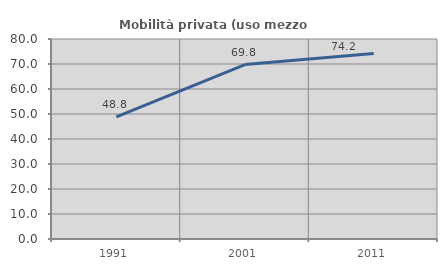
| Category | Mobilità privata (uso mezzo privato) |
|---|---|
| 1991.0 | 48.837 |
| 2001.0 | 69.767 |
| 2011.0 | 74.194 |